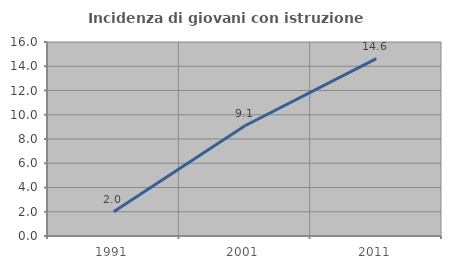
| Category | Incidenza di giovani con istruzione universitaria |
|---|---|
| 1991.0 | 2 |
| 2001.0 | 9.091 |
| 2011.0 | 14.634 |